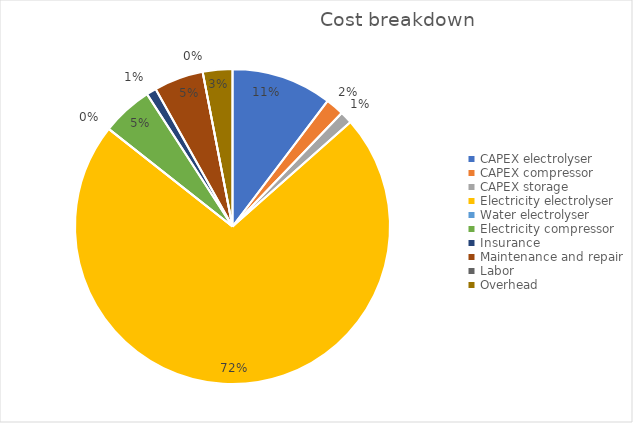
| Category | Series 0 |
|---|---|
| CAPEX electrolyser | 1102.157 |
| CAPEX compressor | 200.408 |
| CAPEX storage | 136.027 |
| Electricity electrolyser | 7707.865 |
| Water electrolyser | 0 |
| Electricity compressor | 560 |
| Insurance | 108.334 |
| Maintenance and repair | 541.671 |
| Labor | 0 |
| Overhead | 325.003 |